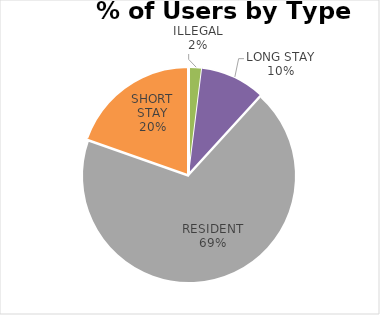
| Category | CHISHOLM ROAD |
|---|---|
| COMMUTER | 0 |
| ILLEGAL | 1 |
| LONG STAY | 5 |
| RESIDENT | 35 |
| SHORT STAY | 10 |
| DISABLED | 0 |
| OTHER | 0 |